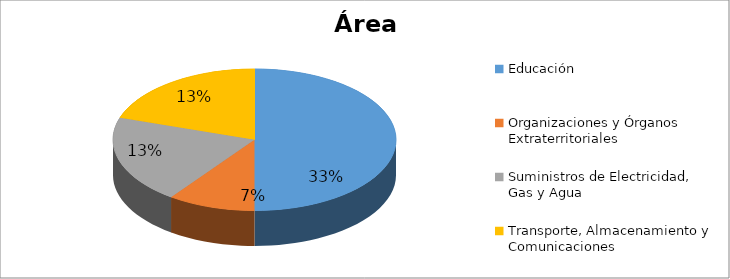
| Category | Series 0 |
|---|---|
| Educación | 0.333 |
| Organizaciones y Órganos Extraterritoriales | 0.067 |
| Suministros de Electricidad, Gas y Agua | 0.133 |
| Transporte, Almacenamiento y Comunicaciones | 0.133 |